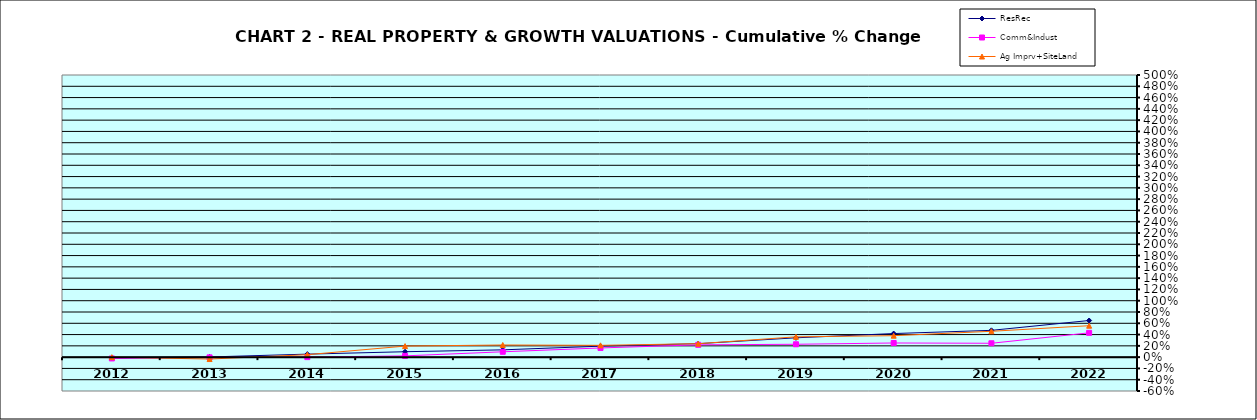
| Category | ResRec | Comm&Indust | Ag Imprv+SiteLand |
|---|---|---|---|
| 2012.0 | -0.012 | -0.023 | 0 |
| 2013.0 | 0.003 | -0.004 | -0.033 |
| 2014.0 | 0.053 | 0 | 0.044 |
| 2015.0 | 0.096 | 0.023 | 0.196 |
| 2016.0 | 0.129 | 0.095 | 0.215 |
| 2017.0 | 0.195 | 0.163 | 0.209 |
| 2018.0 | 0.239 | 0.218 | 0.238 |
| 2019.0 | 0.343 | 0.228 | 0.36 |
| 2020.0 | 0.418 | 0.251 | 0.38 |
| 2021.0 | 0.475 | 0.246 | 0.458 |
| 2022.0 | 0.649 | 0.431 | 0.557 |